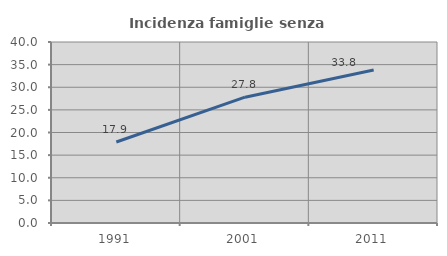
| Category | Incidenza famiglie senza nuclei |
|---|---|
| 1991.0 | 17.895 |
| 2001.0 | 27.804 |
| 2011.0 | 33.82 |